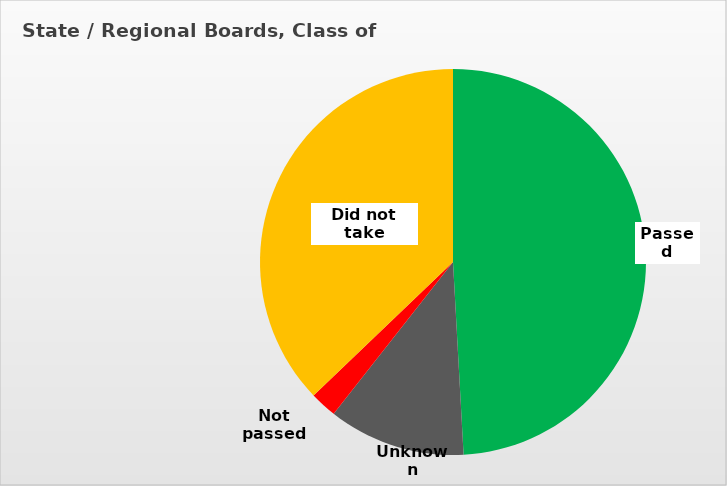
| Category | Series 0 |
|---|---|
| Passed | 0.491 |
| Unknown | 0.115 |
| Not passed | 0.022 |
| Did not take | 0.371 |